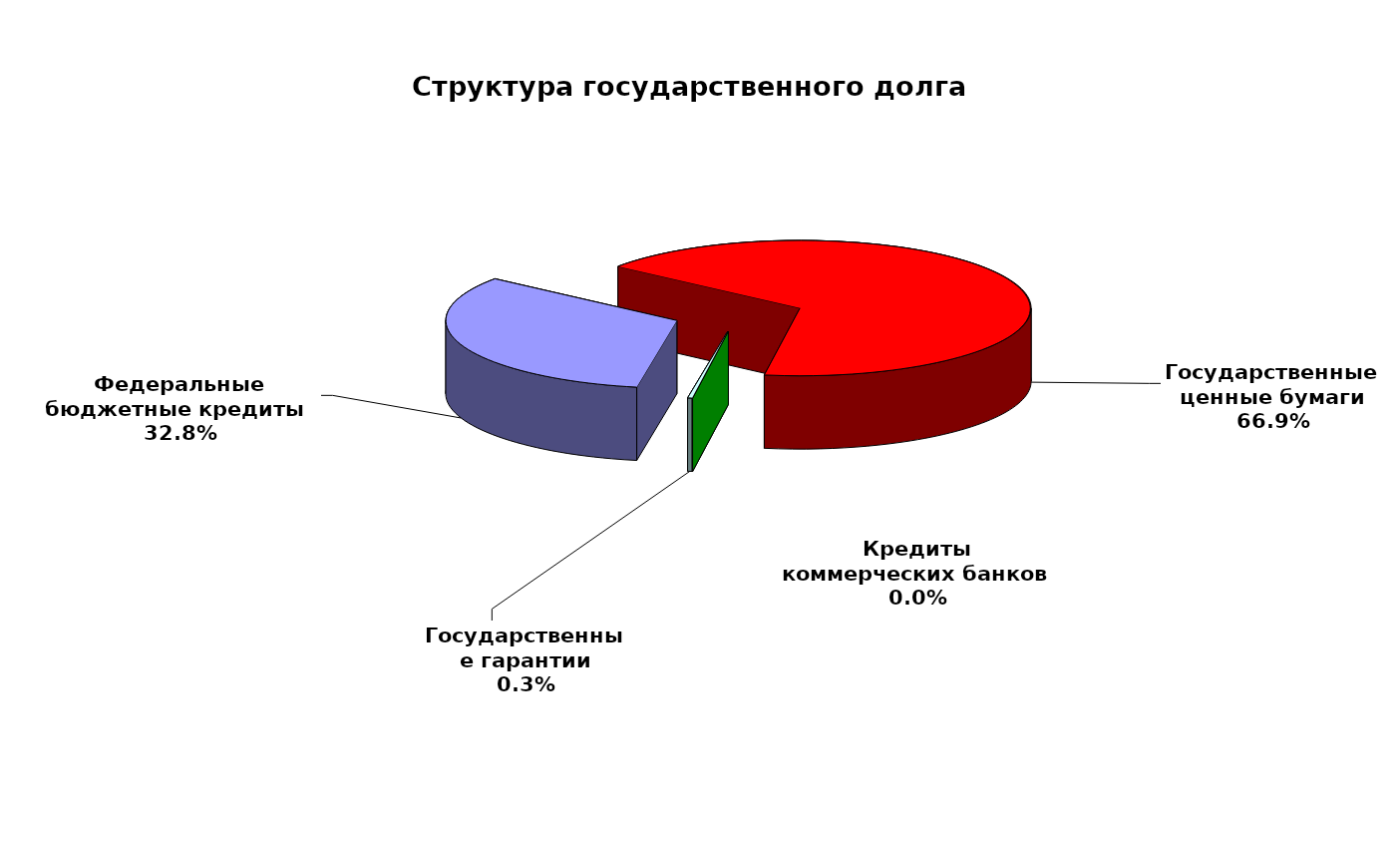
| Category | Series 0 |
|---|---|
| Федеральные бюджетные кредиты  | 19957026.213 |
| Государственные ценные бумаги | 40700000 |
| Кредиты коммерческих банков | 0 |
| Государственные гарантии | 187793.375 |